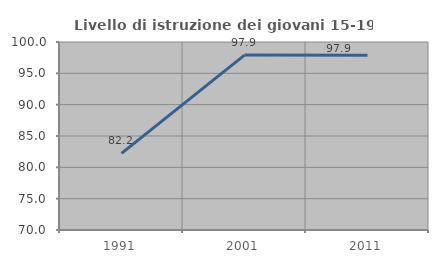
| Category | Livello di istruzione dei giovani 15-19 anni |
|---|---|
| 1991.0 | 82.222 |
| 2001.0 | 97.917 |
| 2011.0 | 97.872 |